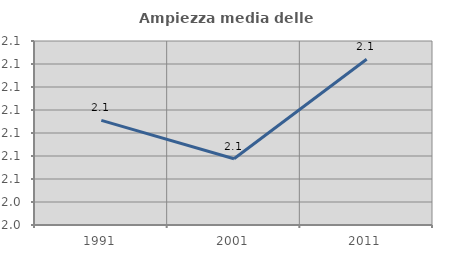
| Category | Ampiezza media delle famiglie |
|---|---|
| 1991.0 | 2.075 |
| 2001.0 | 2.059 |
| 2011.0 | 2.102 |